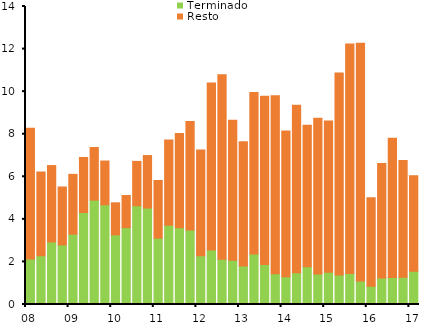
| Category | Terminado | Resto |
|---|---|---|
| 08 | 2142.397 | 6142.92 |
| II | 2294.325 | 3930.675 |
| III | 2937.085 | 3588.915 |
| IV | 2797.265 | 2724.735 |
| 09 | 3304.306 | 2809.694 |
| II | 4319.817 | 2588.055 |
| III | 4904.035 | 2472.965 |
| IV | 4684.195 | 2055.703 |
| 10 | 3270.601 | 1506.399 |
| II | 3611.557 | 1508.443 |
| III | 4640.261 | 2083.686 |
| IV | 4531.294 | 2466.706 |
| 11 | 3118.793 | 2708.097 |
| II | 3722.545 | 4002.872 |
| III | 3601.781 | 4427.739 |
| IV | 3494.515 | 5096.934 |
| 12 | 2291.476 | 4962.524 |
| II | 2557.058 | 7851.942 |
| III | 2129.22 | 8660.78 |
| IV | 2076.07 | 6576.93 |
| 13 | 1812.53 | 5828.47 |
| II | 2369.12 | 7586.88 |
| III | 1880.64 | 7903.36 |
| IV | 1448.34 | 8362.66 |
| 14 | 1300.14 | 6845.86 |
| II | 1490.25 | 7864.62 |
| III | 1771.09 | 6645.91 |
| IV | 1430.75 | 7314.25 |
| 15 | 1518.49 | 7107.08 |
| II | 1387.65 | 9491 |
| III | 1452.585 | 10790.16 |
| IV | 1101.523 | 11169.234 |
| 16 | 852.18 | 4159.82 |
| II | 1247.67 | 5382.14 |
| III | 1270.66 | 6539.435 |
| IV | 1283.32 | 5476.7 |
| 17 | 1564.52 | 4483.44 |